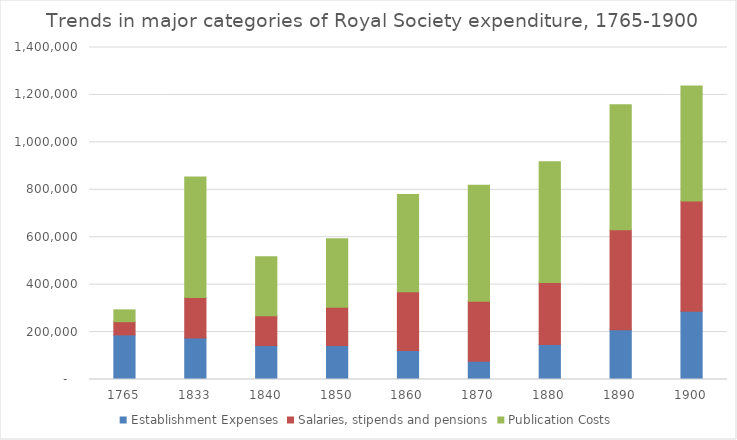
| Category | Establishment Expenses | Salaries, stipends and pensions | Publication Costs |
|---|---|---|---|
| 1765.0 | 188131 | 55680 | 49796 |
| 1833.0 | 175237.5 | 170124 | 508319 |
| 1840.0 | 143107 | 126060 | 248676 |
| 1850.0 | 143133 | 162060 | 288123 |
| 1860.0 | 121995 | 247920 | 410136 |
| 1870.0 | 77204 | 252952 | 488814 |
| 1880.0 | 148023 | 261501 | 509215 |
| 1890.0 | 209996 | 421344 | 527234 |
| 1900.0 | 288289 | 464901 | 483972 |